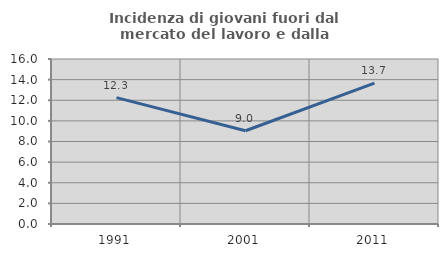
| Category | Incidenza di giovani fuori dal mercato del lavoro e dalla formazione  |
|---|---|
| 1991.0 | 12.255 |
| 2001.0 | 9.045 |
| 2011.0 | 13.665 |